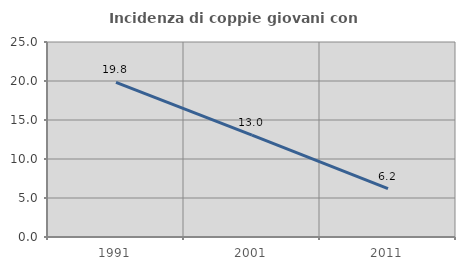
| Category | Incidenza di coppie giovani con figli |
|---|---|
| 1991.0 | 19.822 |
| 2001.0 | 13.048 |
| 2011.0 | 6.197 |